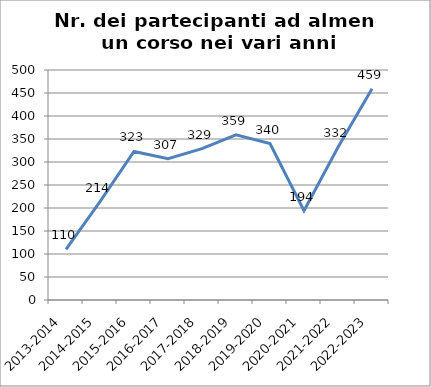
| Category | Nr. Partecipanti ad almeno un Corso |
|---|---|
| 2013-2014 | 110 |
| 2014-2015 | 214 |
| 2015-2016 | 323 |
| 2016-2017 | 307 |
| 2017-2018 | 329 |
| 2018-2019 | 359 |
| 2019-2020 | 340 |
| 2020-2021 | 194 |
| 2021-2022 | 332 |
| 2022-2023 | 459 |